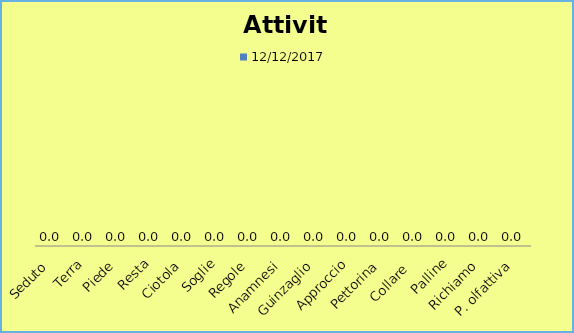
| Category | 12/12/2017 |
|---|---|
| Seduto | 0 |
| Terra | 0 |
| Piede | 0 |
| Resta | 0 |
| Ciotola | 0 |
| Soglie | 0 |
| Regole | 0 |
| Anamnesi | 0 |
| Guinzaglio | 0 |
| Approccio | 0 |
| Pettorina | 0 |
| Collare  | 0 |
| Palline | 0 |
| Richiamo | 0 |
| P. olfattiva | 0 |